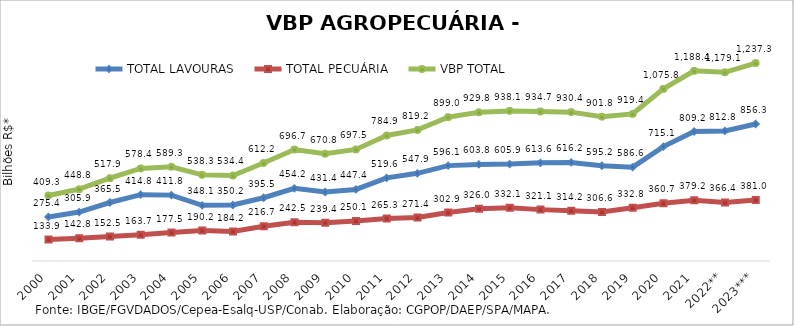
| Category | TOTAL LAVOURAS | TOTAL PECUÁRIA | VBP TOTAL |
|---|---|---|---|
| 2000 | 275.418 | 133.878 | 409.296 |
| 2001 | 305.939 | 142.831 | 448.769 |
| 2002 | 365.454 | 152.473 | 517.927 |
| 2003 | 414.788 | 163.653 | 578.441 |
| 2004 | 411.751 | 177.517 | 589.267 |
| 2005 | 348.117 | 190.164 | 538.28 |
| 2006 | 350.243 | 184.175 | 534.419 |
| 2007 | 395.536 | 216.672 | 612.208 |
| 2008 | 454.173 | 242.508 | 696.681 |
| 2009 | 431.404 | 239.354 | 670.758 |
| 2010 | 447.414 | 250.078 | 697.492 |
| 2011 | 519.616 | 265.269 | 784.885 |
| 2012 | 547.872 | 271.354 | 819.226 |
| 2013 | 596.088 | 302.934 | 899.023 |
| 2014 | 603.757 | 326.044 | 929.801 |
| 2015 | 605.948 | 332.15 | 938.098 |
| 2016 | 613.61 | 321.105 | 934.716 |
| 2017 | 616.158 | 314.206 | 930.364 |
| 2018 | 595.174 | 306.607 | 901.781 |
| 2019 | 586.615 | 332.757 | 919.372 |
| 2020 | 715.098 | 360.687 | 1075.784 |
| 2021 | 809.15 | 379.219 | 1188.37 |
| 2022** | 812.777 | 366.359 | 1179.136 |
| 2023*** | 856.311 | 381.009 | 1237.319 |